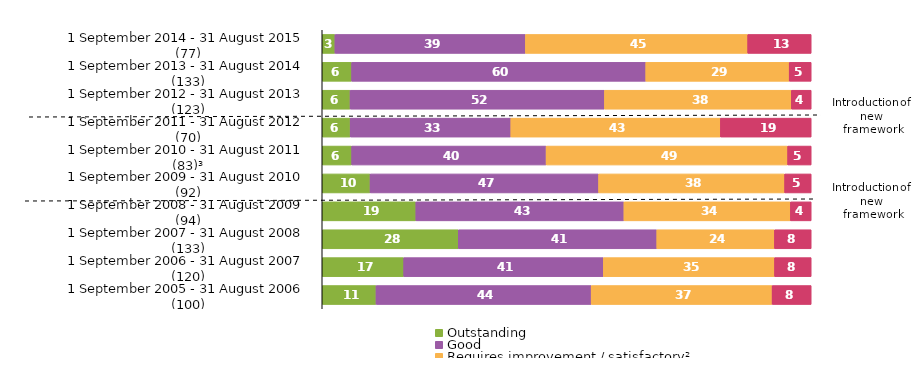
| Category | Outstanding | Good | Requires improvement / satisfactory² | Inadequate |
|---|---|---|---|---|
| 1 September 2014 - 31 August 2015 (77) | 2.597 | 38.961 | 45.455 | 12.987 |
| 1 September 2013 - 31 August 2014 (133) | 6.015 | 60.15 | 29.323 | 4.511 |
| 1 September 2012 - 31 August 2013 (123) | 5.691 | 52.033 | 38.211 | 4.065 |
| 1 September 2011 - 31 August 2012 (70) | 5.714 | 32.857 | 42.857 | 18.571 |
| 1 September 2010 - 31 August 2011 (83)³ | 6.024 | 39.759 | 49.398 | 4.819 |
| 1 September 2009 - 31 August 2010 (92) | 9.783 | 46.739 | 38.043 | 5.435 |
| 1 September 2008 - 31 August 2009 (94) | 19.149 | 42.553 | 34.043 | 4.255 |
| 1 September 2007 - 31 August 2008 (133) | 27.82 | 40.602 | 24.06 | 7.519 |
| 1 September 2006 - 31 August 2007 (120) | 16.667 | 40.833 | 35 | 7.5 |
| 1 September 2005 - 31 August 2006 (100) | 11 | 44 | 37 | 8 |